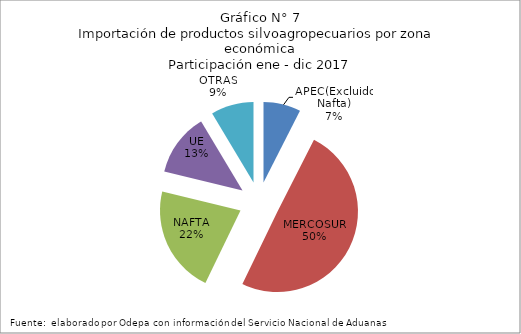
| Category | Series 0 |
|---|---|
| APEC(Excluido Nafta) | 437334.093 |
| MERCOSUR | 2903303.908 |
| NAFTA | 1261346.876 |
| UE | 739008.607 |
| OTRAS | 501323.516 |